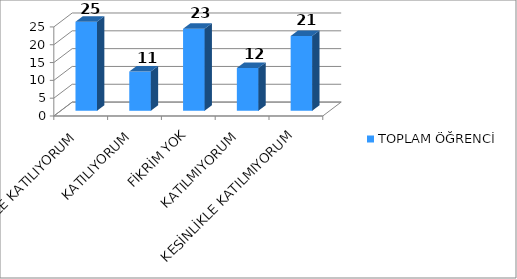
| Category | TOPLAM ÖĞRENCİ |
|---|---|
| KESİNLİKLE KATILIYORUM | 25 |
| KATILIYORUM | 11 |
| FİKRİM YOK | 23 |
| KATILMIYORUM | 12 |
| KESİNLİKLE KATILMIYORUM | 21 |